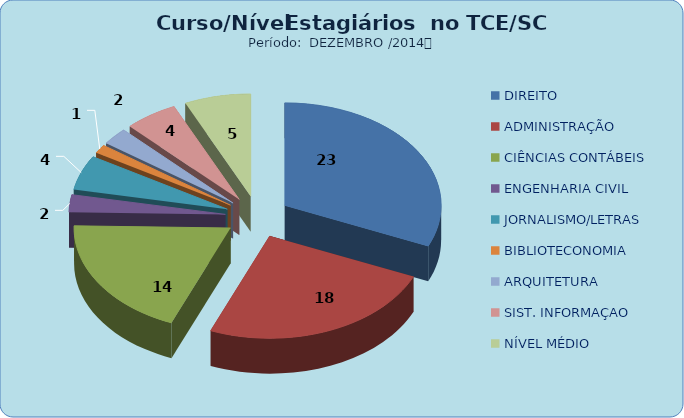
| Category | Series 0 |
|---|---|
| DIREITO | 23 |
| ADMINISTRAÇÃO | 18 |
| CIÊNCIAS CONTÁBEIS | 14 |
| ENGENHARIA CIVIL | 2 |
| JORNALISMO/LETRAS | 4 |
| BIBLIOTECONOMIA | 1 |
| ARQUITETURA | 2 |
| SIST. INFORMAÇAO | 4 |
| NÍVEL MÉDIO | 5 |